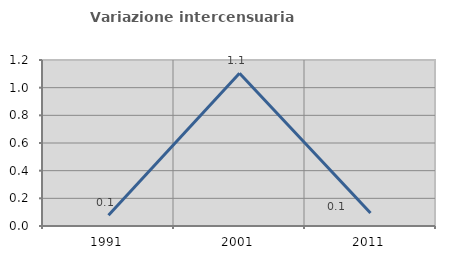
| Category | Variazione intercensuaria annua |
|---|---|
| 1991.0 | 0.078 |
| 2001.0 | 1.105 |
| 2011.0 | 0.094 |